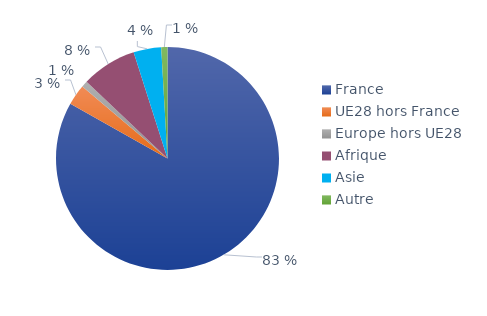
| Category | Series 0 |
|---|---|
| France | 0.83 |
| UE28 hors France | 0.03 |
| Europe hors UE28 | 0.009 |
| Afrique | 0.08 |
| Asie | 0.04 |
| Autre | 0.009 |